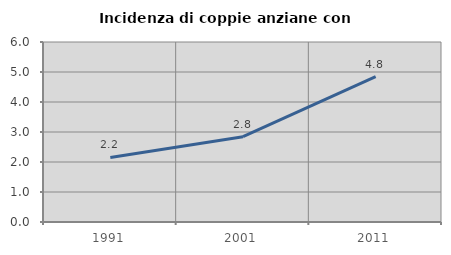
| Category | Incidenza di coppie anziane con figli |
|---|---|
| 1991.0 | 2.152 |
| 2001.0 | 2.843 |
| 2011.0 | 4.843 |